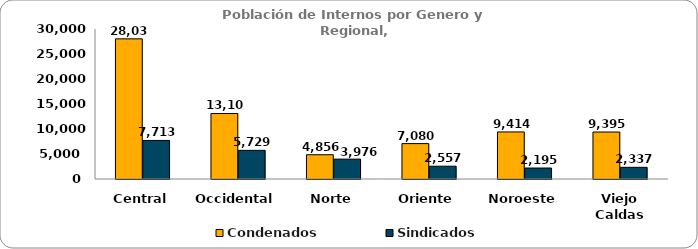
| Category | Condenados | Sindicados |
|---|---|---|
| Central | 28031 | 7713 |
| Occidental | 13103 | 5729 |
| Norte | 4856 | 3976 |
| Oriente | 7080 | 2557 |
| Noroeste | 9414 | 2195 |
| Viejo Caldas | 9395 | 2337 |